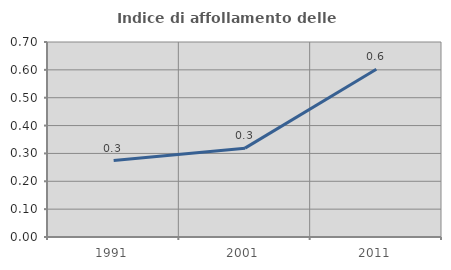
| Category | Indice di affollamento delle abitazioni  |
|---|---|
| 1991.0 | 0.274 |
| 2001.0 | 0.319 |
| 2011.0 | 0.602 |